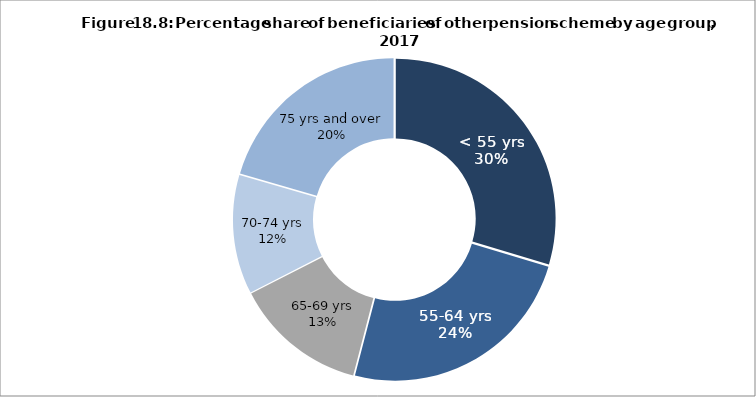
| Category | Series 0 |
|---|---|
| < 55 yrs | 29.634 |
| 55-64 yrs | 24.425 |
| 65-69 yrs | 13.411 |
| 70-74 yrs | 12.039 |
| 75 yrs and over | 20.49 |